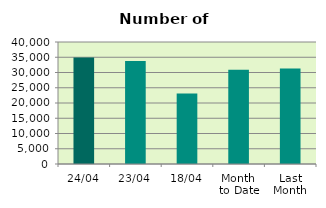
| Category | Series 0 |
|---|---|
| 24/04 | 34918 |
| 23/04 | 33794 |
| 18/04 | 23146 |
| Month 
to Date | 30871.25 |
| Last
Month | 31344.095 |